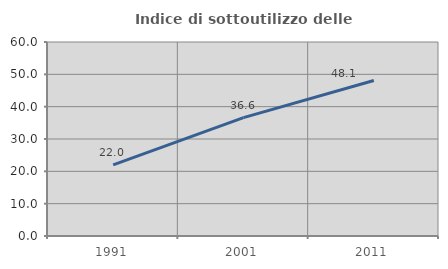
| Category | Indice di sottoutilizzo delle abitazioni  |
|---|---|
| 1991.0 | 22.002 |
| 2001.0 | 36.614 |
| 2011.0 | 48.079 |